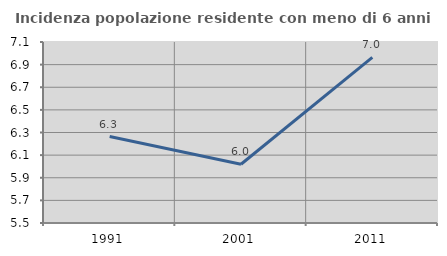
| Category | Incidenza popolazione residente con meno di 6 anni |
|---|---|
| 1991.0 | 6.264 |
| 2001.0 | 6.02 |
| 2011.0 | 6.964 |